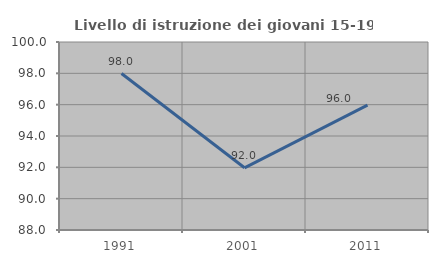
| Category | Livello di istruzione dei giovani 15-19 anni |
|---|---|
| 1991.0 | 97.987 |
| 2001.0 | 91.971 |
| 2011.0 | 95.973 |